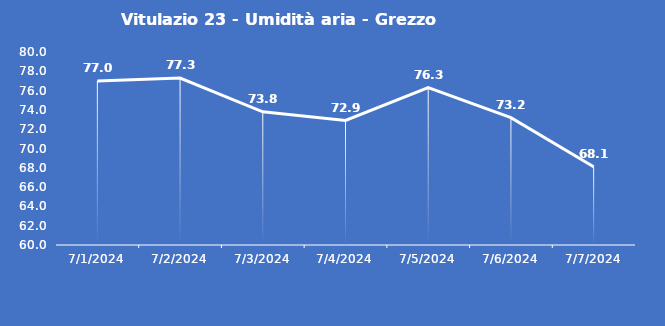
| Category | Vitulazio 23 - Umidità aria - Grezzo (%) |
|---|---|
| 7/1/24 | 77 |
| 7/2/24 | 77.3 |
| 7/3/24 | 73.8 |
| 7/4/24 | 72.9 |
| 7/5/24 | 76.3 |
| 7/6/24 | 73.2 |
| 7/7/24 | 68.1 |